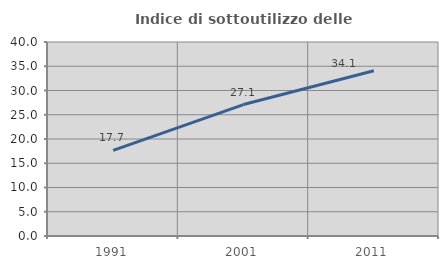
| Category | Indice di sottoutilizzo delle abitazioni  |
|---|---|
| 1991.0 | 17.663 |
| 2001.0 | 27.101 |
| 2011.0 | 34.062 |